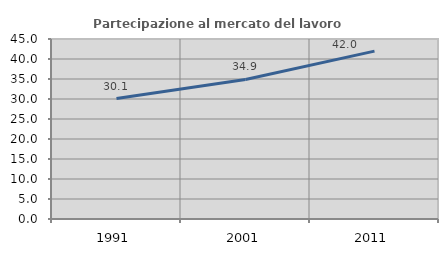
| Category | Partecipazione al mercato del lavoro  femminile |
|---|---|
| 1991.0 | 30.124 |
| 2001.0 | 34.88 |
| 2011.0 | 41.975 |